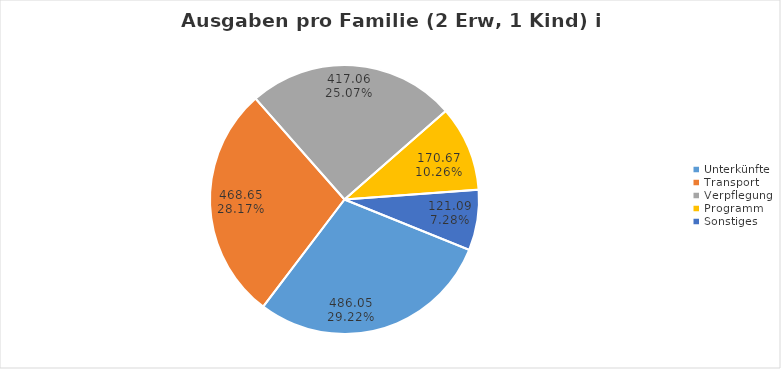
| Category | Series 0 |
|---|---|
| Unterkünfte | 486.051 |
| Transport | 468.648 |
| Verpflegung | 417.058 |
| Programm | 170.669 |
| Sonstiges | 121.091 |